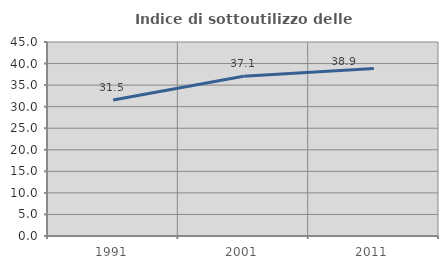
| Category | Indice di sottoutilizzo delle abitazioni  |
|---|---|
| 1991.0 | 31.532 |
| 2001.0 | 37.062 |
| 2011.0 | 38.879 |